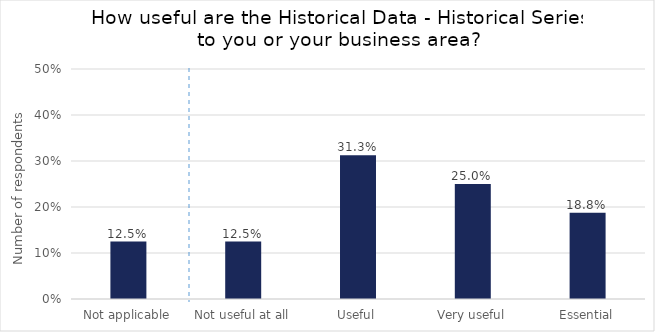
| Category | How useful are the Historical Data - Historical Series to you or your business area? |
|---|---|
| Not applicable | 0.125 |
| Not useful at all | 0.125 |
| Useful | 0.312 |
| Very useful | 0.25 |
| Essential | 0.188 |